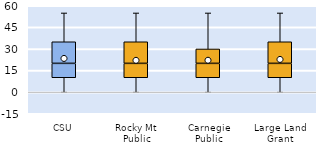
| Category | 25th | 50th | 75th |
|---|---|---|---|
| CSU | 10 | 10 | 15 |
| Rocky Mt Public | 10 | 10 | 15 |
| Carnegie Public | 10 | 10 | 10 |
| Large Land Grant | 10 | 10 | 15 |